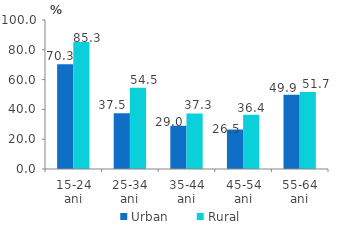
| Category | Urban | Rural |
|---|---|---|
| 15-24 ani | 70.3 | 85.3 |
| 25-34 ani | 37.5 | 54.5 |
| 35-44 ani | 29 | 37.3 |
| 45-54 ani | 26.5 | 36.4 |
| 55-64 ani | 49.9 | 51.7 |